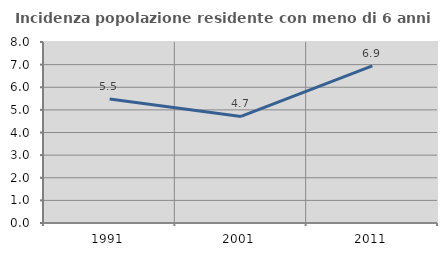
| Category | Incidenza popolazione residente con meno di 6 anni |
|---|---|
| 1991.0 | 5.485 |
| 2001.0 | 4.71 |
| 2011.0 | 6.944 |